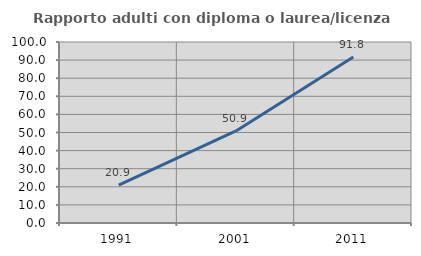
| Category | Rapporto adulti con diploma o laurea/licenza media  |
|---|---|
| 1991.0 | 20.946 |
| 2001.0 | 50.857 |
| 2011.0 | 91.758 |